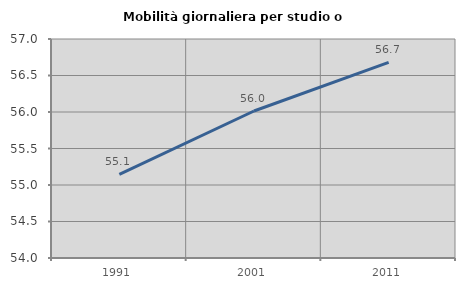
| Category | Mobilità giornaliera per studio o lavoro |
|---|---|
| 1991.0 | 55.145 |
| 2001.0 | 56.014 |
| 2011.0 | 56.681 |